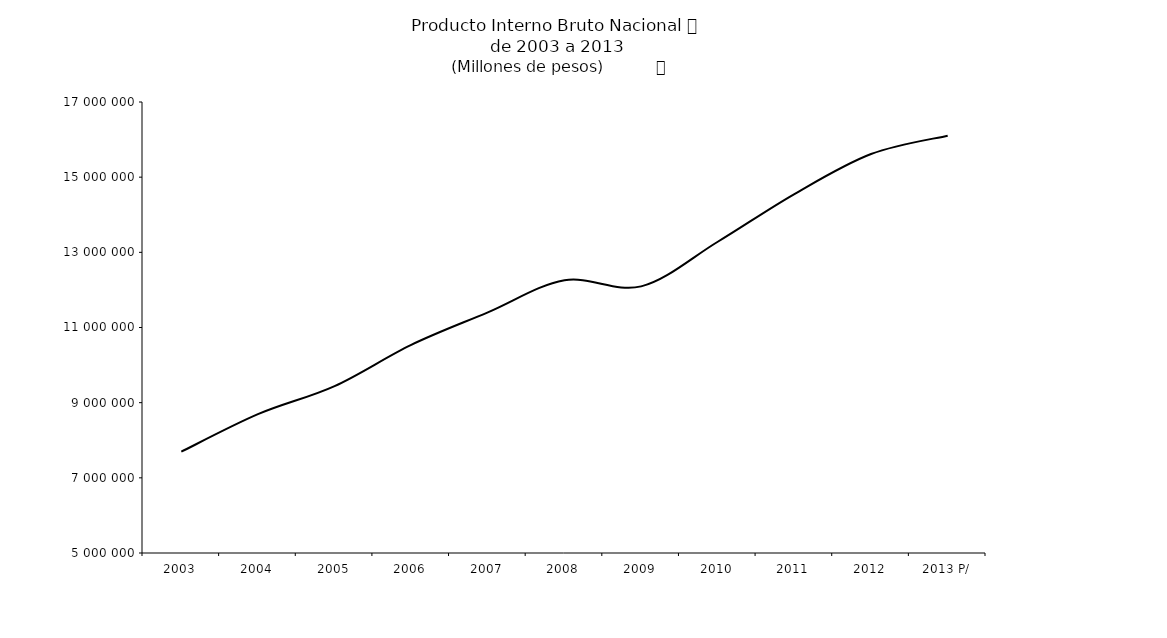
| Category | Producto Interno Bruto a precios de mercado  |
|---|---|
| 2003 | 7695623.568 |
| 2004 | 8693240.003 |
| 2005 | 9441350.139 |
| 2006 | 10538114.503 |
| 2007 | 11403263.293 |
| 2008 | 12256863.469 |
| 2009 | 12093889.909 |
| 2010 | 13282061.033 |
| 2011 | 14550013.913 |
| 2012 | 15615011.781 |
| 2013 P/ | 16104402.059 |